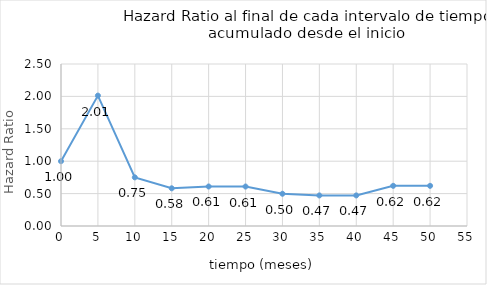
| Category | HRi |
|---|---|
| 0.0 | 1 |
| 5.0 | 2.012 |
| 10.0 | 0.751 |
| 15.0 | 0.582 |
| 20.0 | 0.61 |
| 25.0 | 0.609 |
| 30.0 | 0.498 |
| 35.0 | 0.472 |
| 40.0 | 0.472 |
| 45.0 | 0.62 |
| 50.0 | 0.62 |